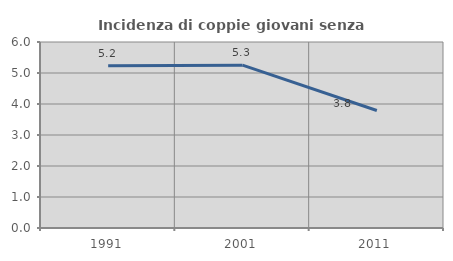
| Category | Incidenza di coppie giovani senza figli |
|---|---|
| 1991.0 | 5.237 |
| 2001.0 | 5.253 |
| 2011.0 | 3.789 |